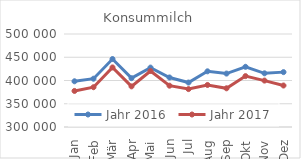
| Category | Jahr 2016 | Jahr 2017 |
|---|---|---|
| Jan | 398314.202 | 377536.88 |
| Feb | 403860.829 | 385559.302 |
| Mär | 446193.974 | 428077.87 |
| Apr | 405025.483 | 387392.767 |
| Mai | 427765.37 | 420418.405 |
| Jun | 406503.269 | 388866.209 |
| Jul | 395606.69 | 381535.436 |
| Aug | 419757.846 | 390374.571 |
| Sep | 414914.745 | 383229.234 |
| Okt | 429480.778 | 409455.327 |
| Nov | 415452.359 | 399824.36 |
| Dez | 418016.095 | 389207.977 |